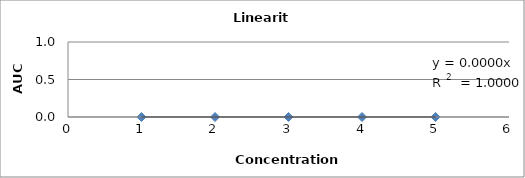
| Category | Linearity |
|---|---|
|  | 0 |
|  | 0 |
|  | 0 |
|  | 0 |
|  | 0 |